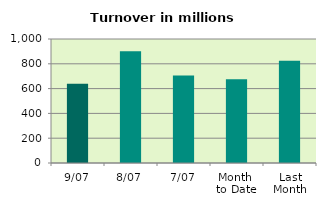
| Category | Series 0 |
|---|---|
| 9/07 | 639.368 |
| 8/07 | 902.113 |
| 7/07 | 706.421 |
| Month 
to Date | 674.678 |
| Last
Month | 824.124 |